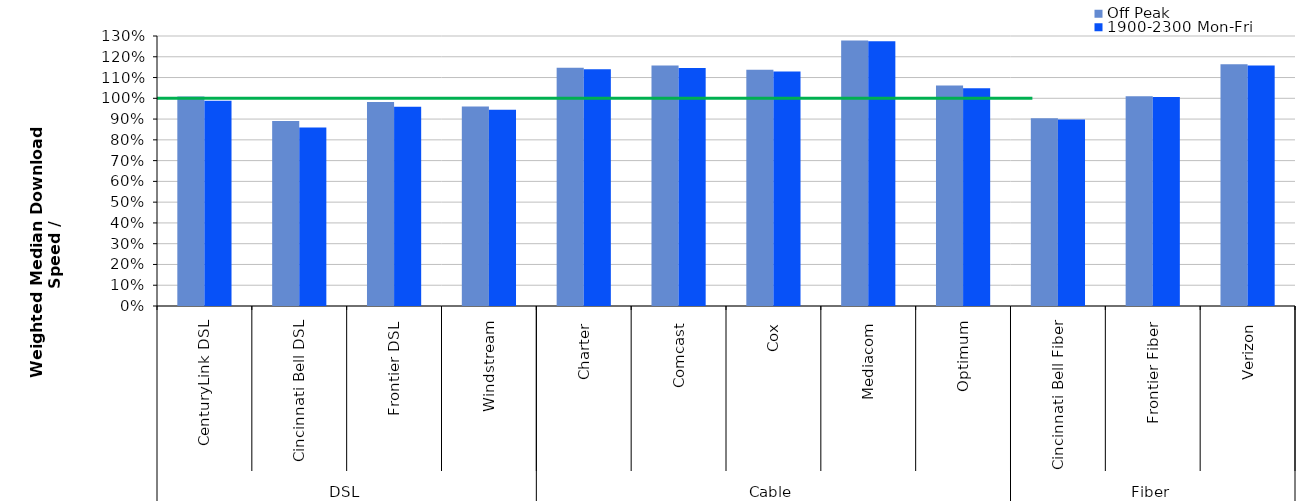
| Category | Off Peak | 1900-2300 Mon-Fri |
|---|---|---|
| 0 | 1.009 | 0.988 |
| 1 | 0.89 | 0.859 |
| 2 | 0.983 | 0.959 |
| 3 | 0.961 | 0.944 |
| 4 | 1.147 | 1.14 |
| 5 | 1.158 | 1.145 |
| 6 | 1.137 | 1.129 |
| 7 | 1.279 | 1.275 |
| 8 | 1.062 | 1.048 |
| 9 | 0.904 | 0.898 |
| 10 | 1.01 | 1.007 |
| 11 | 1.164 | 1.158 |